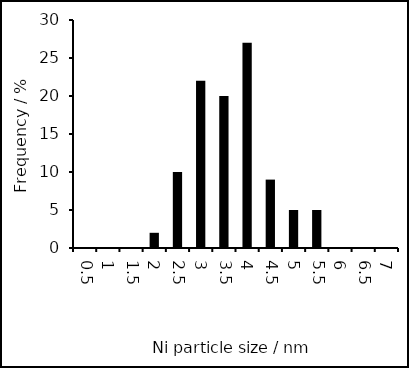
| Category | Series 0 |
|---|---|
| 0.5 | 0 |
| 1.0 | 0 |
| 1.5 | 0 |
| 2.0 | 2 |
| 2.5 | 10 |
| 3.0 | 22 |
| 3.5 | 20 |
| 4.0 | 27 |
| 4.5 | 9 |
| 5.0 | 5 |
| 5.5 | 5 |
| 6.0 | 0 |
| 6.5 | 0 |
| 7.0 | 0 |